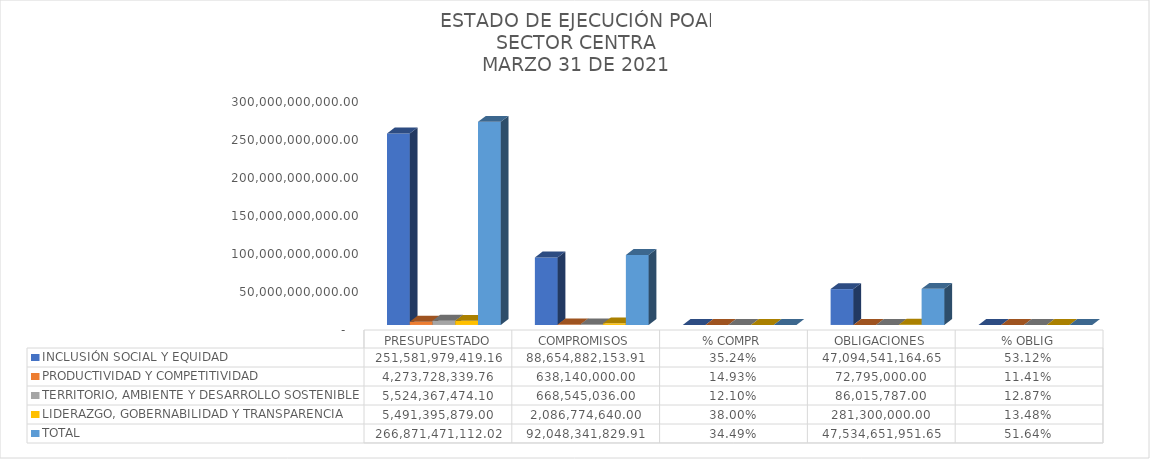
| Category | INCLUSIÓN SOCIAL Y EQUIDAD  | PRODUCTIVIDAD Y COMPETITIVIDAD | TERRITORIO, AMBIENTE Y DESARROLLO SOSTENIBLE  | LIDERAZGO, GOBERNABILIDAD Y TRANSPARENCIA  | TOTAL |
|---|---|---|---|---|---|
| PRESUPUESTADO | 251581979419.16 | 4273728339.76 | 5524367474.1 | 5491395879 | 266871471112.02 |
| COMPROMISOS | 88654882153.91 | 638140000 | 668545036 | 2086774640 | 92048341829.91 |
| % COMPR | 0.352 | 0.149 | 0.121 | 0.38 | 0.345 |
| OBLIGACIONES | 47094541164.65 | 72795000 | 86015787 | 281300000 | 47534651951.65 |
| % OBLIG | 0.531 | 0.114 | 0.129 | 0.135 | 0.516 |